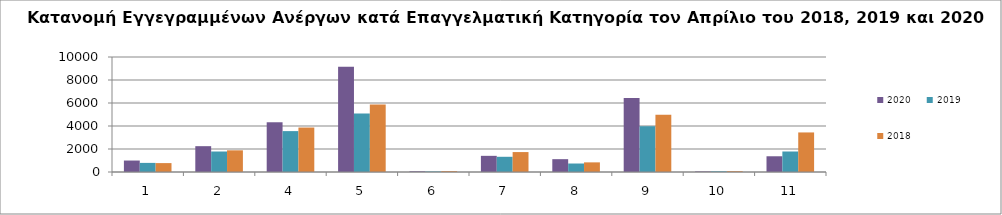
| Category | 2020 | 2019 | 2018 |
|---|---|---|---|
| 1.0 | 997 | 792 | 774 |
| 2.0 | 2246 | 1782 | 1885 |
| 4.0 | 4325 | 3556 | 3866 |
| 5.0 | 9159 | 5094 | 5866 |
| 6.0 | 61 | 46 | 76 |
| 7.0 | 1405 | 1323 | 1733 |
| 8.0 | 1116 | 738 | 838 |
| 9.0 | 6433 | 3981 | 4988 |
| 10.0 | 49 | 59 | 70 |
| 11.0 | 1368 | 1783 | 3440 |